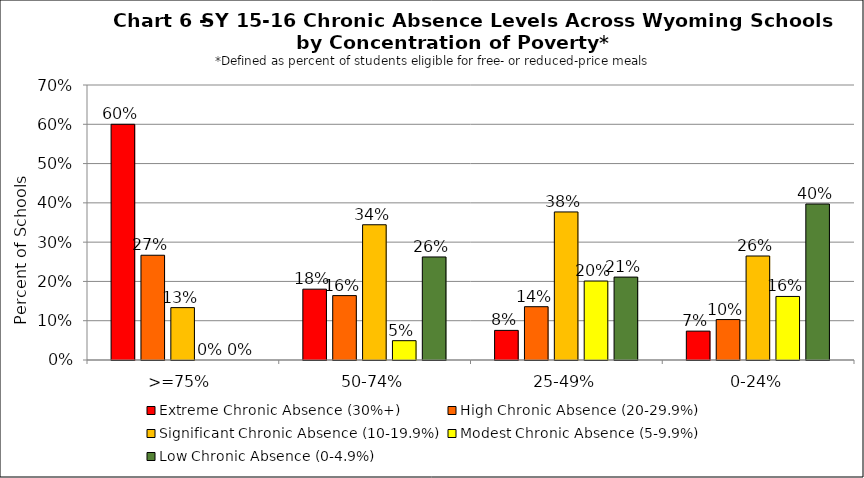
| Category | Extreme Chronic Absence (30%+) | High Chronic Absence (20-29.9%) | Significant Chronic Absence (10-19.9%) | Modest Chronic Absence (5-9.9%) | Low Chronic Absence (0-4.9%) |
|---|---|---|---|---|---|
| 0 | 0.6 | 0.267 | 0.133 | 0 | 0 |
| 1 | 0.18 | 0.164 | 0.344 | 0.049 | 0.262 |
| 2 | 0.075 | 0.136 | 0.377 | 0.201 | 0.211 |
| 3 | 0.074 | 0.103 | 0.265 | 0.162 | 0.397 |